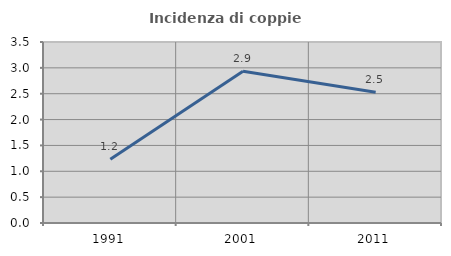
| Category | Incidenza di coppie miste |
|---|---|
| 1991.0 | 1.232 |
| 2001.0 | 2.933 |
| 2011.0 | 2.53 |